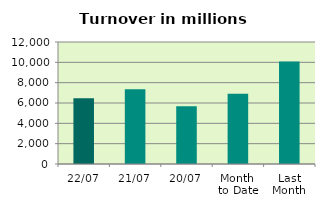
| Category | Series 0 |
|---|---|
| 22/07 | 6468.89 |
| 21/07 | 7342.264 |
| 20/07 | 5686.53 |
| Month 
to Date | 6907.119 |
| Last
Month | 10085.686 |